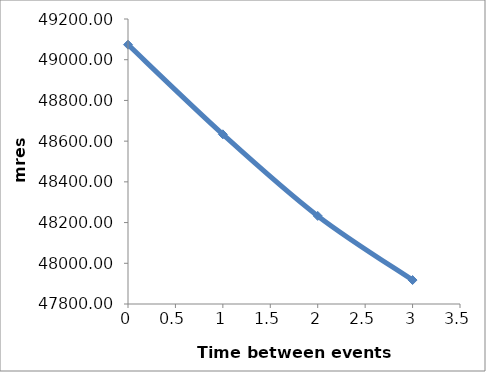
| Category | Series 0 |
|---|---|
| 0.0 | 49073.898 |
| 1.0 | 48633.411 |
| 2.0 | 48232.802 |
| 3.0 | 47917.625 |